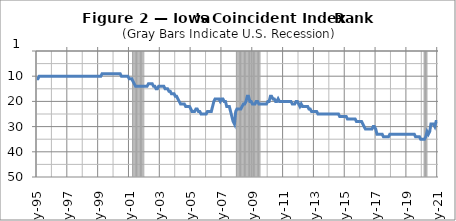
| Category | Series 1 |
|---|---|
| 1995-05-01 | 0 |
| 1995-06-01 | 0 |
| 1995-07-01 | 0 |
| 1995-08-01 | 0 |
| 1995-09-01 | 0 |
| 1995-10-01 | 0 |
| 1995-11-01 | 0 |
| 1995-12-01 | 0 |
| 1996-01-01 | 0 |
| 1996-02-01 | 0 |
| 1996-03-01 | 0 |
| 1996-04-01 | 0 |
| 1996-05-01 | 0 |
| 1996-06-01 | 0 |
| 1996-07-01 | 0 |
| 1996-08-01 | 0 |
| 1996-09-01 | 0 |
| 1996-10-01 | 0 |
| 1996-11-01 | 0 |
| 1996-12-01 | 0 |
| 1997-01-01 | 0 |
| 1997-02-01 | 0 |
| 1997-03-01 | 0 |
| 1997-04-01 | 0 |
| 1997-05-01 | 0 |
| 1997-06-01 | 0 |
| 1997-07-01 | 0 |
| 1997-08-01 | 0 |
| 1997-09-01 | 0 |
| 1997-10-01 | 0 |
| 1997-11-01 | 0 |
| 1997-12-01 | 0 |
| 1998-01-01 | 0 |
| 1998-02-01 | 0 |
| 1998-03-01 | 0 |
| 1998-04-01 | 0 |
| 1998-05-01 | 0 |
| 1998-06-01 | 0 |
| 1998-07-01 | 0 |
| 1998-08-01 | 0 |
| 1998-09-01 | 0 |
| 1998-10-01 | 0 |
| 1998-11-01 | 0 |
| 1998-12-01 | 0 |
| 1999-01-01 | 0 |
| 1999-02-01 | 0 |
| 1999-03-01 | 0 |
| 1999-04-01 | 0 |
| 1999-05-01 | 0 |
| 1999-06-01 | 0 |
| 1999-07-01 | 0 |
| 1999-08-01 | 0 |
| 1999-09-01 | 0 |
| 1999-10-01 | 0 |
| 1999-11-01 | 0 |
| 1999-12-01 | 0 |
| 2000-01-01 | 0 |
| 2000-02-01 | 0 |
| 2000-03-01 | 0 |
| 2000-04-01 | 0 |
| 2000-05-01 | 0 |
| 2000-06-01 | 0 |
| 2000-07-01 | 0 |
| 2000-08-01 | 0 |
| 2000-09-01 | 0 |
| 2000-10-01 | 0 |
| 2000-11-01 | 0 |
| 2000-12-01 | 0 |
| 2001-01-01 | 0 |
| 2001-02-01 | 0 |
| 2001-03-01 | 0 |
| 2001-04-01 | 0 |
| 2001-05-01 | 0 |
| 2001-06-01 | 0 |
| 2001-07-01 | 20000 |
| 2001-08-01 | 20000 |
| 2001-09-01 | 20000 |
| 2001-10-01 | 20000 |
| 2001-11-01 | 20000 |
| 2001-12-01 | 20000 |
| 2002-01-01 | 20000 |
| 2002-02-01 | 20000 |
| 2002-03-01 | 20000 |
| 2002-04-01 | 0 |
| 2002-05-01 | 0 |
| 2002-06-01 | 0 |
| 2002-07-01 | 0 |
| 2002-08-01 | 0 |
| 2002-09-01 | 0 |
| 2002-10-01 | 0 |
| 2002-11-01 | 0 |
| 2002-12-01 | 0 |
| 2003-01-01 | 0 |
| 2003-02-01 | 0 |
| 2003-03-01 | 0 |
| 2003-04-01 | 0 |
| 2003-05-01 | 0 |
| 2003-06-01 | 0 |
| 2003-07-01 | 0 |
| 2003-08-01 | 0 |
| 2003-09-01 | 0 |
| 2003-10-01 | 0 |
| 2003-11-01 | 0 |
| 2003-12-01 | 0 |
| 2004-01-01 | 0 |
| 2004-02-01 | 0 |
| 2004-03-01 | 0 |
| 2004-04-01 | 0 |
| 2004-05-01 | 0 |
| 2004-06-01 | 0 |
| 2004-07-01 | 0 |
| 2004-08-01 | 0 |
| 2004-09-01 | 0 |
| 2004-10-01 | 0 |
| 2004-11-01 | 0 |
| 2004-12-01 | 0 |
| 2005-01-01 | 0 |
| 2005-02-01 | 0 |
| 2005-03-01 | 0 |
| 2005-04-01 | 0 |
| 2005-05-01 | 0 |
| 2005-06-01 | 0 |
| 2005-07-01 | 0 |
| 2005-08-01 | 0 |
| 2005-09-01 | 0 |
| 2005-10-01 | 0 |
| 2005-11-01 | 0 |
| 2005-12-01 | 0 |
| 2006-01-01 | 0 |
| 2006-02-01 | 0 |
| 2006-03-01 | 0 |
| 2006-04-01 | 0 |
| 2006-05-01 | 0 |
| 2006-06-01 | 0 |
| 2006-07-01 | 0 |
| 2006-08-01 | 0 |
| 2006-09-01 | 0 |
| 2006-10-01 | 0 |
| 2006-11-01 | 0 |
| 2006-12-01 | 0 |
| 2007-01-01 | 0 |
| 2007-02-01 | 0 |
| 2007-03-01 | 0 |
| 2007-04-01 | 0 |
| 2007-05-01 | 0 |
| 2007-06-01 | 0 |
| 2007-07-01 | 0 |
| 2007-08-01 | 0 |
| 2007-09-01 | 0 |
| 2007-10-01 | 0 |
| 2007-11-01 | 0 |
| 2007-12-01 | 0 |
| 2008-01-01 | 0 |
| 2008-02-01 | 0 |
| 2008-03-01 | 0 |
| 2008-04-01 | 20000 |
| 2008-05-01 | 20000 |
| 2008-06-01 | 20000 |
| 2008-07-01 | 20000 |
| 2008-08-01 | 20000 |
| 2008-09-01 | 20000 |
| 2008-10-01 | 20000 |
| 2008-11-01 | 20000 |
| 2008-12-01 | 20000 |
| 2009-01-01 | 20000 |
| 2009-02-01 | 20000 |
| 2009-03-01 | 20000 |
| 2009-04-01 | 20000 |
| 2009-05-01 | 20000 |
| 2009-06-01 | 20000 |
| 2009-07-01 | 20000 |
| 2009-08-01 | 20000 |
| 2009-09-01 | 20000 |
| 2009-10-01 | 20000 |
| 2009-11-01 | 0 |
| 2009-12-01 | 0 |
| 2010-01-01 | 0 |
| 2010-02-01 | 0 |
| 2010-03-01 | 0 |
| 2010-04-01 | 0 |
| 2010-05-01 | 0 |
| 2010-06-01 | 0 |
| 2010-07-01 | 0 |
| 2010-08-01 | 0 |
| 2010-09-01 | 0 |
| 2010-10-01 | 0 |
| 2010-11-01 | 0 |
| 2010-12-01 | 0 |
| 2011-01-01 | 0 |
| 2011-02-01 | 0 |
| 2011-03-01 | 0 |
| 2011-04-01 | 0 |
| 2011-05-01 | 0 |
| 2011-06-01 | 0 |
| 2011-07-01 | 0 |
| 2011-08-01 | 0 |
| 2011-09-01 | 0 |
| 2011-10-01 | 0 |
| 2011-11-01 | 0 |
| 2011-12-01 | 0 |
| 2012-01-01 | 0 |
| 2012-02-01 | 0 |
| 2012-03-01 | 0 |
| 2012-04-01 | 0 |
| 2012-05-01 | 0 |
| 2012-06-01 | 0 |
| 2012-07-01 | 0 |
| 2012-08-01 | 0 |
| 2012-09-01 | 0 |
| 2012-10-01 | 0 |
| 2012-11-01 | 0 |
| 2012-12-01 | 0 |
| 2013-01-01 | 0 |
| 2013-02-01 | 0 |
| 2013-03-01 | 0 |
| 2013-04-01 | 0 |
| 2013-05-01 | 0 |
| 2013-06-01 | 0 |
| 2013-07-01 | 0 |
| 2013-08-01 | 0 |
| 2013-09-01 | 0 |
| 2013-10-01 | 0 |
| 2013-11-01 | 0 |
| 2013-12-01 | 0 |
| 2014-01-01 | 0 |
| 2014-02-01 | 0 |
| 2014-03-01 | 0 |
| 2014-04-01 | 0 |
| 2014-05-01 | 0 |
| 2014-06-01 | 0 |
| 2014-07-01 | 0 |
| 2014-08-01 | 0 |
| 2014-09-01 | 0 |
| 2014-10-01 | 0 |
| 2014-11-01 | 0 |
| 2014-12-01 | 0 |
| 2015-01-01 | 0 |
| 2015-02-01 | 0 |
| 2015-03-01 | 0 |
| 2015-04-01 | 0 |
| 2015-05-01 | 0 |
| 2015-06-01 | 0 |
| 2015-07-01 | 0 |
| 2015-08-01 | 0 |
| 2015-09-01 | 0 |
| 2015-10-01 | 0 |
| 2015-11-01 | 0 |
| 2015-12-01 | 0 |
| 2016-01-01 | 0 |
| 2016-02-01 | 0 |
| 2016-03-01 | 0 |
| 2016-04-01 | 0 |
| 2016-05-01 | 0 |
| 2016-06-01 | 0 |
| 2016-07-01 | 0 |
| 2016-08-01 | 0 |
| 2016-09-01 | 0 |
| 2016-10-01 | 0 |
| 2016-11-01 | 0 |
| 2016-12-01 | 0 |
| 2017-01-01 | 0 |
| 2017-02-01 | 0 |
| 2017-03-01 | 0 |
| 2017-04-01 | 0 |
| 2017-05-01 | 0 |
| 2017-06-01 | 0 |
| 2017-07-01 | 0 |
| 2017-08-01 | 0 |
| 2017-09-01 | 0 |
| 2017-10-01 | 0 |
| 2017-11-01 | 0 |
| 2017-12-01 | 0 |
| 2018-01-01 | 0 |
| 2018-02-01 | 0 |
| 2018-03-01 | 0 |
| 2018-04-01 | 0 |
| 2018-05-01 | 0 |
| 2018-06-01 | 0 |
| 2018-07-01 | 0 |
| 2018-08-01 | 0 |
| 2018-09-01 | 0 |
| 2018-10-01 | 0 |
| 2018-11-01 | 0 |
| 2018-12-01 | 0 |
| 2019-01-01 | 0 |
| 2019-02-01 | 0 |
| 2019-03-01 | 0 |
| 2019-04-01 | 0 |
| 2019-05-01 | 0 |
| 2019-06-01 | 0 |
| 2019-07-01 | 0 |
| 2019-08-01 | 0 |
| 2019-09-01 | 0 |
| 2019-10-01 | 0 |
| 2019-11-01 | 0 |
| 2019-12-01 | 0 |
| 2020-01-01 | 0 |
| 2020-02-01 | 0 |
| 2020-03-01 | 0 |
| 2020-04-01 | 0 |
| 2020-05-01 | 0 |
| 2020-06-01 | 20000 |
| 2020-07-01 | 20000 |
| 2020-08-01 | 20000 |
| 2020-09-01 | 0 |
| 2020-10-01 | 0 |
| 2020-11-01 | 0 |
| 2020-12-01 | 0 |
| 2021-01-01 | 0 |
| 2021-02-01 | 0 |
| 2021-03-01 | 0 |
| 2021-04-01 | 0 |
| 2021-05-01 | 0 |